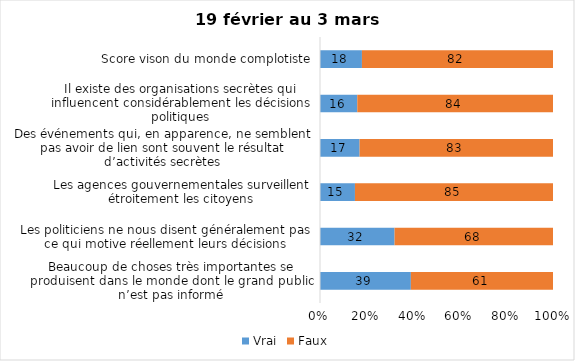
| Category | Vrai | Faux |
|---|---|---|
| Beaucoup de choses très importantes se produisent dans le monde dont le grand public n’est pas informé | 39 | 61 |
| Les politiciens ne nous disent généralement pas ce qui motive réellement leurs décisions | 32 | 68 |
| Les agences gouvernementales surveillent étroitement les citoyens | 15 | 85 |
| Des événements qui, en apparence, ne semblent pas avoir de lien sont souvent le résultat d’activités secrètes | 17 | 83 |
| Il existe des organisations secrètes qui influencent considérablement les décisions politiques | 16 | 84 |
| Score vison du monde complotiste | 18 | 82 |